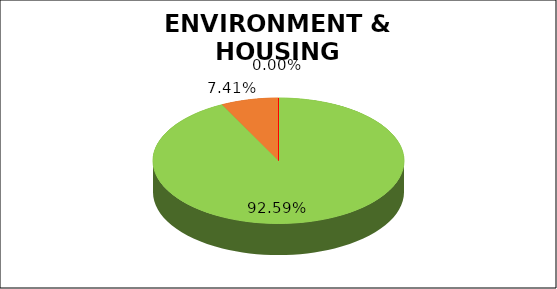
| Category | Q2 |
|---|---|
| Green | 0.926 |
| Amber | 0.074 |
| Red | 0 |